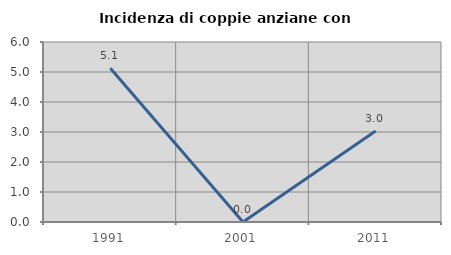
| Category | Incidenza di coppie anziane con figli |
|---|---|
| 1991.0 | 5.128 |
| 2001.0 | 0 |
| 2011.0 | 3.03 |